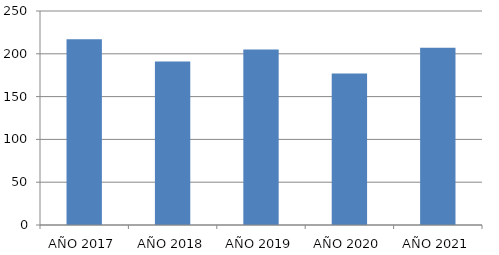
| Category | Series 0 |
|---|---|
| AÑO 2017 | 217 |
| AÑO 2018 | 191 |
| AÑO 2019 | 205 |
| AÑO 2020 | 177 |
| AÑO 2021 | 207 |